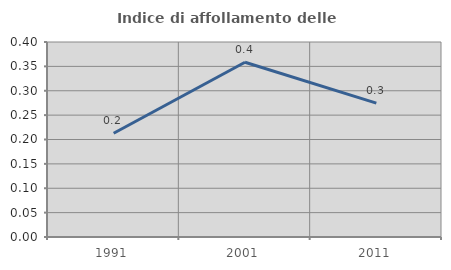
| Category | Indice di affollamento delle abitazioni  |
|---|---|
| 1991.0 | 0.213 |
| 2001.0 | 0.358 |
| 2011.0 | 0.275 |